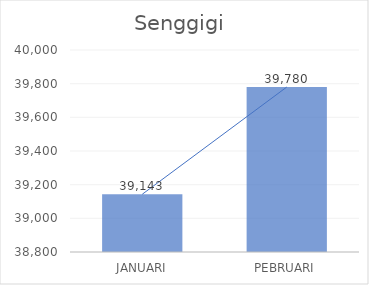
| Category |  39,143  |
|---|---|
| JANUARI | 39143 |
| PEBRUARI | 39780 |